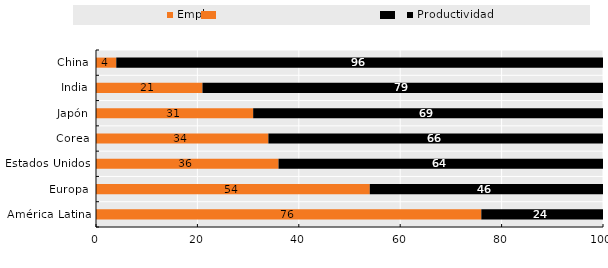
| Category | Empleo | Productividad |
|---|---|---|
| China | 4 | 96 |
| India | 21 | 79 |
| Japón | 31 | 69 |
| Corea | 34 | 66 |
| Estados Unidos | 36 | 64 |
| Europa | 54 | 46 |
| América Latina | 76 | 24 |